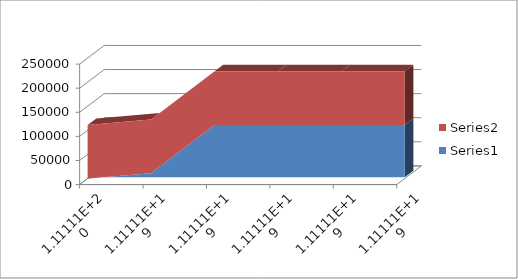
| Category | Series 0 | Series 1 |
|---|---|---|
| 1.11111111111111e+20 | 1 | 111111 |
| 1.11111111111111e+19 | 11111 | 111111 |
| 1.11111111111111e+19 | 111111 | 111111 |
| 1.11111111111111e+19 | 111111 | 111111 |
| 1.11111111111111e+19 | 111111 | 111111 |
| 1.11111111111111e+19 | 111111 | 111111 |